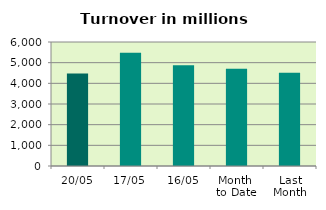
| Category | Series 0 |
|---|---|
| 20/05 | 4478.039 |
| 17/05 | 5481.381 |
| 16/05 | 4877.022 |
| Month 
to Date | 4701.879 |
| Last
Month | 4514.737 |